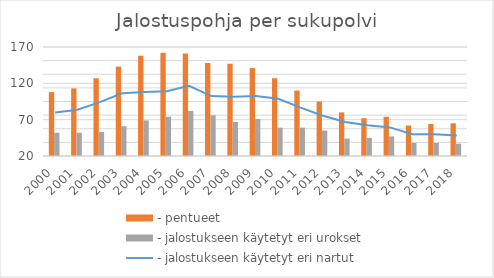
| Category | - pentueet | - jalostukseen käytetyt eri urokset |
|---|---|---|
| 2000.0 | 108 | 52 |
| 2001.0 | 113 | 52 |
| 2002.0 | 127 | 53 |
| 2003.0 | 143 | 61 |
| 2004.0 | 158 | 69 |
| 2005.0 | 162 | 74 |
| 2006.0 | 161 | 82 |
| 2007.0 | 148 | 76 |
| 2008.0 | 147 | 67 |
| 2009.0 | 141 | 71 |
| 2010.0 | 127 | 59 |
| 2011.0 | 110 | 59 |
| 2012.0 | 95 | 55 |
| 2013.0 | 80 | 44 |
| 2014.0 | 72 | 45 |
| 2015.0 | 74 | 47 |
| 2016.0 | 62 | 38 |
| 2017.0 | 64 | 38 |
| 2018.0 | 65 | 37 |